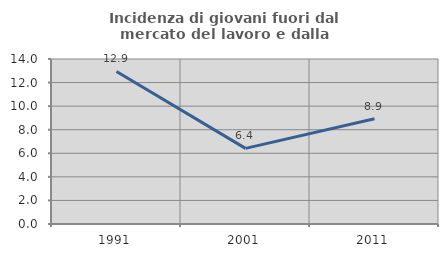
| Category | Incidenza di giovani fuori dal mercato del lavoro e dalla formazione  |
|---|---|
| 1991.0 | 12.941 |
| 2001.0 | 6.415 |
| 2011.0 | 8.929 |